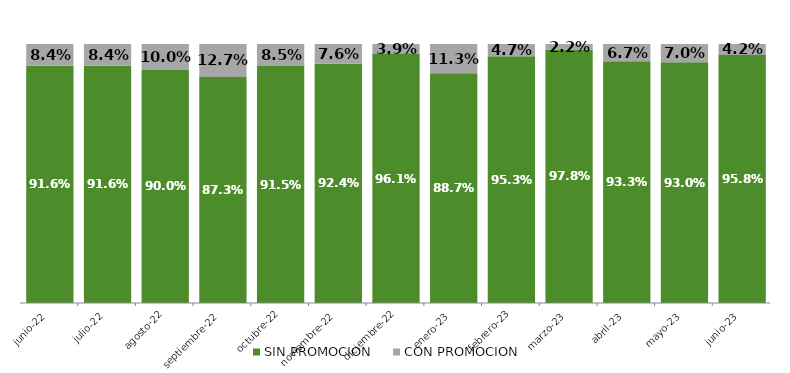
| Category | SIN PROMOCION   | CON PROMOCION   |
|---|---|---|
| 2022-06-01 | 0.916 | 0.084 |
| 2022-07-01 | 0.916 | 0.084 |
| 2022-08-01 | 0.9 | 0.1 |
| 2022-09-01 | 0.873 | 0.127 |
| 2022-10-01 | 0.915 | 0.085 |
| 2022-11-01 | 0.924 | 0.076 |
| 2022-12-01 | 0.961 | 0.039 |
| 2023-01-01 | 0.887 | 0.113 |
| 2023-02-01 | 0.953 | 0.047 |
| 2023-03-01 | 0.978 | 0.022 |
| 2023-04-01 | 0.933 | 0.067 |
| 2023-05-01 | 0.93 | 0.07 |
| 2023-06-01 | 0.958 | 0.042 |